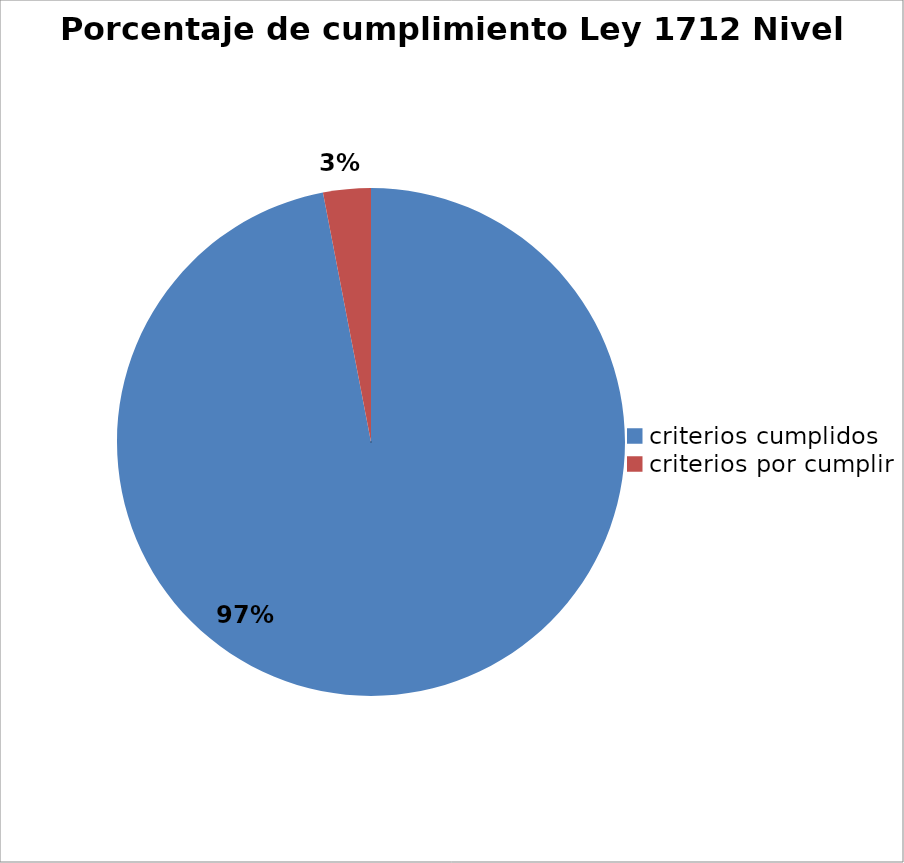
| Category | Series 0 |
|---|---|
| criterios cumplidos | 128 |
| criterios por cumplir | 4 |